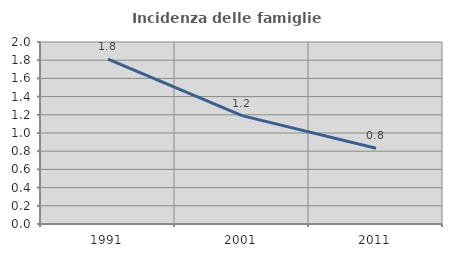
| Category | Incidenza delle famiglie numerose |
|---|---|
| 1991.0 | 1.812 |
| 2001.0 | 1.191 |
| 2011.0 | 0.832 |